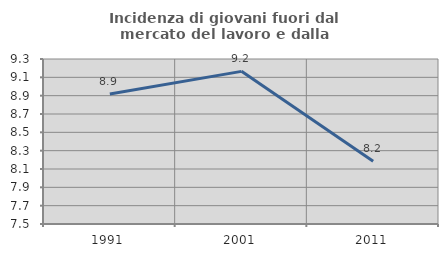
| Category | Incidenza di giovani fuori dal mercato del lavoro e dalla formazione  |
|---|---|
| 1991.0 | 8.919 |
| 2001.0 | 9.165 |
| 2011.0 | 8.185 |